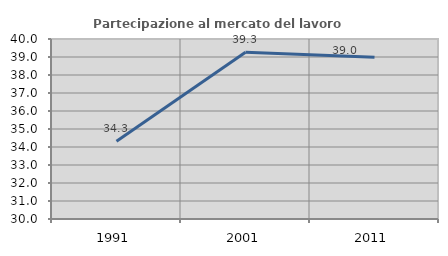
| Category | Partecipazione al mercato del lavoro  femminile |
|---|---|
| 1991.0 | 34.314 |
| 2001.0 | 39.262 |
| 2011.0 | 38.983 |